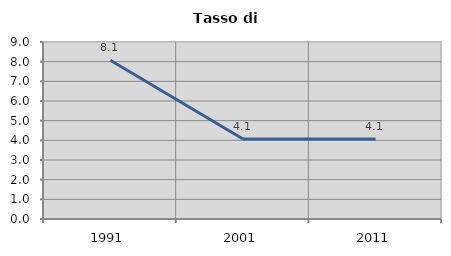
| Category | Tasso di disoccupazione   |
|---|---|
| 1991.0 | 8.072 |
| 2001.0 | 4.064 |
| 2011.0 | 4.062 |